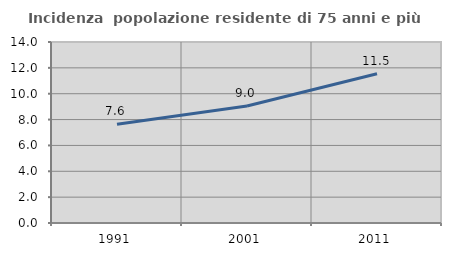
| Category | Incidenza  popolazione residente di 75 anni e più |
|---|---|
| 1991.0 | 7.644 |
| 2001.0 | 9.044 |
| 2011.0 | 11.544 |